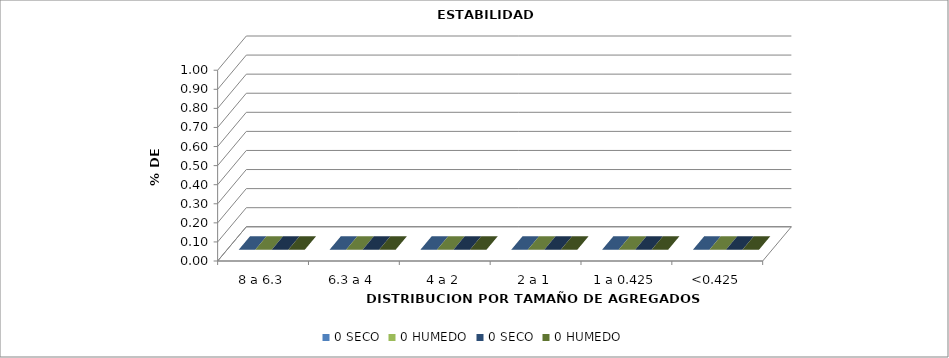
| Category | 0 |
|---|---|
| 8 a 6.3 | 0 |
| 6.3 a 4 | 0 |
| 4 a 2 | 0 |
| 2 a 1 | 0 |
| 1 a 0.425 | 0 |
| <0.425 | 0 |